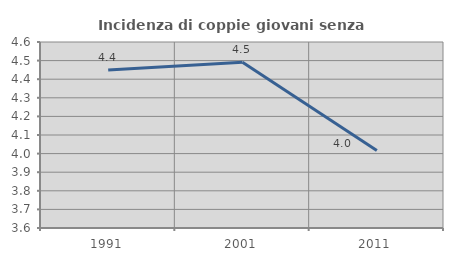
| Category | Incidenza di coppie giovani senza figli |
|---|---|
| 1991.0 | 4.45 |
| 2001.0 | 4.491 |
| 2011.0 | 4.017 |